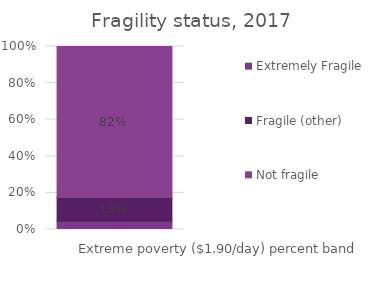
| Category | Extremely Fragile | Fragile (other) | Not fragile |
|---|---|---|---|
| 0 | 0.045 | 0.131 | 0.825 |